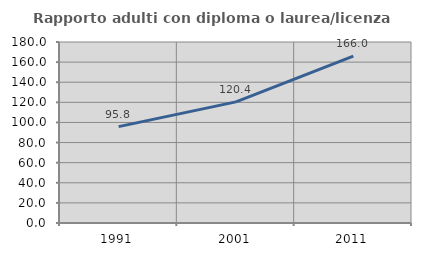
| Category | Rapporto adulti con diploma o laurea/licenza media  |
|---|---|
| 1991.0 | 95.849 |
| 2001.0 | 120.44 |
| 2011.0 | 165.975 |